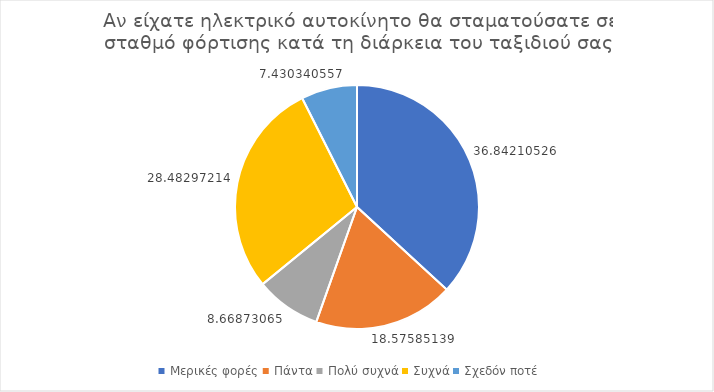
| Category | Series 0 |
|---|---|
| Μερικές φορές | 36.842 |
| Πάντα | 18.576 |
| Πολύ συχνά | 8.669 |
| Συχνά | 28.483 |
| Σχεδόν ποτέ | 7.43 |